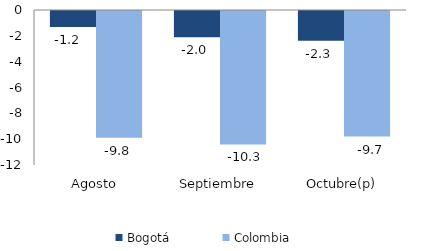
| Category | Bogotá | Colombia |
|---|---|---|
| Agosto | -1.233 | -9.814 |
| Septiembre | -2.036 | -10.331 |
| Octubre(p) | -2.298 | -9.716 |